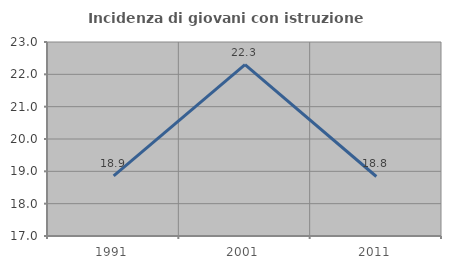
| Category | Incidenza di giovani con istruzione universitaria |
|---|---|
| 1991.0 | 18.861 |
| 2001.0 | 22.297 |
| 2011.0 | 18.841 |